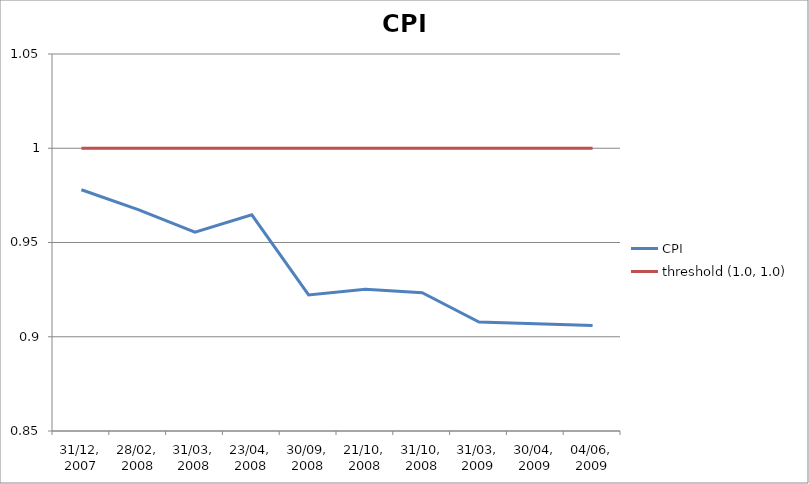
| Category | CPI | threshold (1.0, 1.0) |
|---|---|---|
| 31/12, 2007 | 0.978 | 1 |
| 28/02, 2008 | 0.967 | 1 |
| 31/03, 2008 | 0.955 | 1 |
| 23/04, 2008 | 0.965 | 1 |
| 30/09, 2008 | 0.922 | 1 |
| 21/10, 2008 | 0.925 | 1 |
| 31/10, 2008 | 0.923 | 1 |
| 31/03, 2009 | 0.908 | 1 |
| 30/04, 2009 | 0.907 | 1 |
| 04/06, 2009 | 0.906 | 1 |